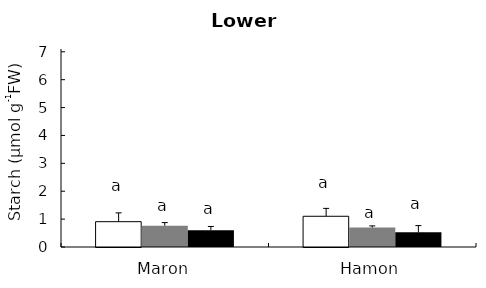
| Category | 14 DAA AVR | non-defoliated AVR | Defoliated AVR |
|---|---|---|---|
| Maron | 0.908 | 0.762 | 0.602 |
| Hamon | 1.102 | 0.699 | 0.526 |